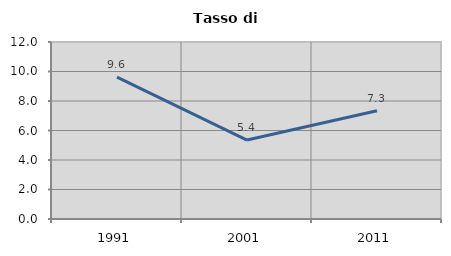
| Category | Tasso di disoccupazione   |
|---|---|
| 1991.0 | 9.623 |
| 2001.0 | 5.354 |
| 2011.0 | 7.341 |